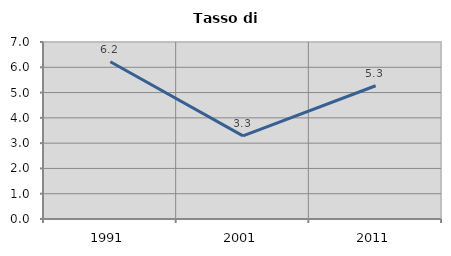
| Category | Tasso di disoccupazione   |
|---|---|
| 1991.0 | 6.217 |
| 2001.0 | 3.287 |
| 2011.0 | 5.27 |